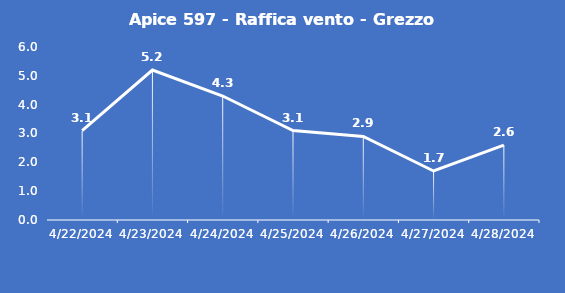
| Category | Apice 597 - Raffica vento - Grezzo (m/s) |
|---|---|
| 4/22/24 | 3.1 |
| 4/23/24 | 5.2 |
| 4/24/24 | 4.3 |
| 4/25/24 | 3.1 |
| 4/26/24 | 2.9 |
| 4/27/24 | 1.7 |
| 4/28/24 | 2.6 |